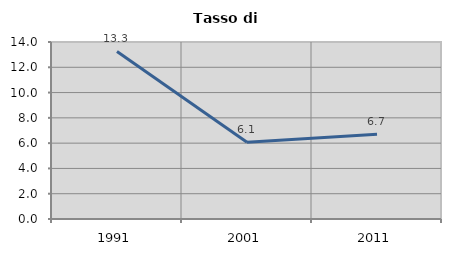
| Category | Tasso di disoccupazione   |
|---|---|
| 1991.0 | 13.254 |
| 2001.0 | 6.076 |
| 2011.0 | 6.697 |